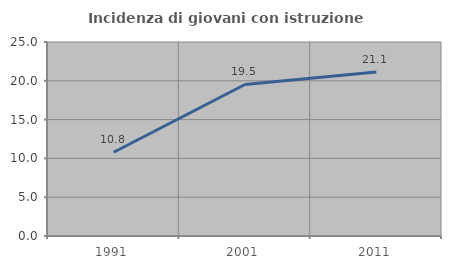
| Category | Incidenza di giovani con istruzione universitaria |
|---|---|
| 1991.0 | 10.787 |
| 2001.0 | 19.529 |
| 2011.0 | 21.132 |